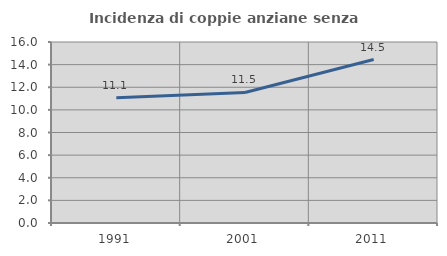
| Category | Incidenza di coppie anziane senza figli  |
|---|---|
| 1991.0 | 11.077 |
| 2001.0 | 11.538 |
| 2011.0 | 14.453 |